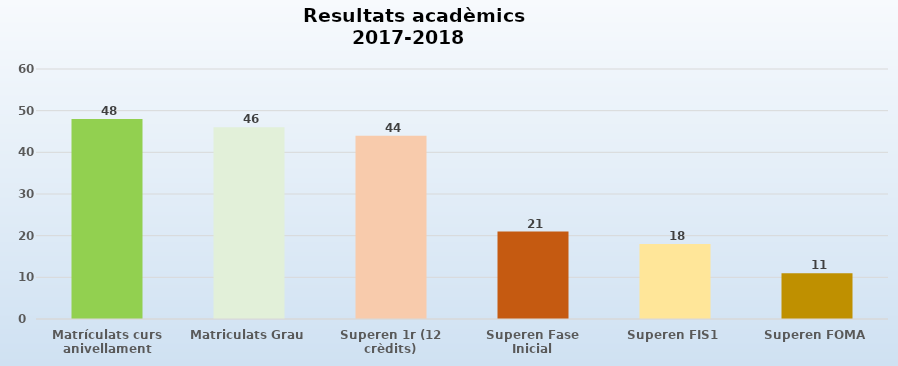
| Category | Series 0 |
|---|---|
| Matrículats curs anivellament | 48 |
| Matriculats Grau | 46 |
| Superen 1r (12 crèdits) | 44 |
| Superen Fase Inicial | 21 |
| Superen FIS1 | 18 |
| Superen FOMA | 11 |